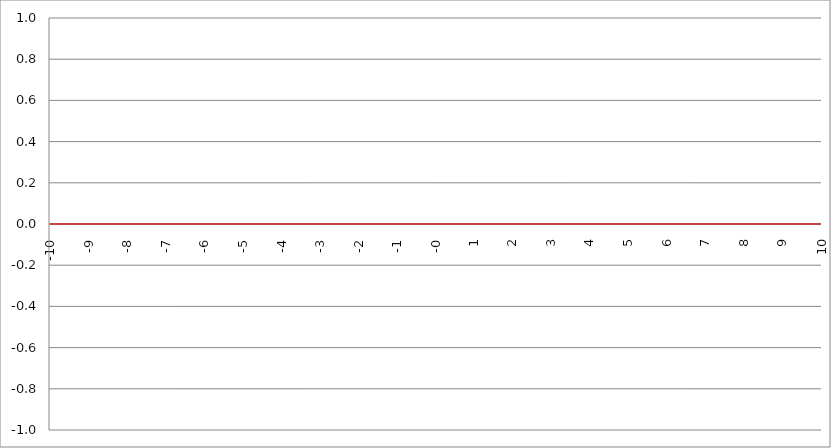
| Category | Series 1 | Series 0 | Series 2 |
|---|---|---|---|
| -10.0 | 0 |  |  |
| -9.99 | 0 |  |  |
| -9.98 | 0 |  |  |
| -9.97 | 0 |  |  |
| -9.96 | 0 |  |  |
| -9.95 | 0 |  |  |
| -9.940000000000001 | 0 |  |  |
| -9.930000000000001 | 0 |  |  |
| -9.920000000000002 | 0 |  |  |
| -9.91 | 0 |  |  |
| -9.900000000000002 | 0 |  |  |
| -9.890000000000002 | 0 |  |  |
| -9.880000000000003 | 0 |  |  |
| -9.870000000000003 | 0 |  |  |
| -9.860000000000001 | 0 |  |  |
| -9.850000000000003 | 0 |  |  |
| -9.840000000000003 | 0 |  |  |
| -9.830000000000004 | 0 |  |  |
| -9.820000000000004 | 0 |  |  |
| -9.810000000000004 | 0 |  |  |
| -9.800000000000004 | 0 |  |  |
| -9.790000000000004 | 0 |  |  |
| -9.780000000000005 | 0 |  |  |
| -9.770000000000005 | 0 |  |  |
| -9.760000000000005 | 0 |  |  |
| -9.750000000000005 | 0 |  |  |
| -9.740000000000006 | 0 |  |  |
| -9.730000000000006 | 0 |  |  |
| -9.720000000000006 | 0 |  |  |
| -9.710000000000006 | 0 |  |  |
| -9.700000000000006 | 0 |  |  |
| -9.690000000000007 | 0 |  |  |
| -9.680000000000007 | 0 |  |  |
| -9.670000000000007 | 0 |  |  |
| -9.660000000000007 | 0 |  |  |
| -9.650000000000007 | 0 |  |  |
| -9.640000000000008 | 0 |  |  |
| -9.630000000000008 | 0 |  |  |
| -9.620000000000008 | 0 |  |  |
| -9.610000000000008 | 0 |  |  |
| -9.600000000000009 | 0 |  |  |
| -9.590000000000009 | 0 |  |  |
| -9.580000000000007 | 0 |  |  |
| -9.57000000000001 | 0 |  |  |
| -9.56000000000001 | 0 |  |  |
| -9.55000000000001 | 0 |  |  |
| -9.54000000000001 | 0 |  |  |
| -9.53000000000001 | 0 |  |  |
| -9.52000000000001 | 0 |  |  |
| -9.51000000000001 | 0 |  |  |
| -9.50000000000001 | 0 |  |  |
| -9.49000000000001 | 0 |  |  |
| -9.48000000000001 | 0 |  |  |
| -9.47000000000001 | 0 |  |  |
| -9.46000000000001 | 0 |  |  |
| -9.45000000000001 | 0 |  |  |
| -9.44000000000001 | 0 |  |  |
| -9.430000000000012 | 0 |  |  |
| -9.420000000000012 | 0 |  |  |
| -9.410000000000013 | 0 |  |  |
| -9.400000000000013 | 0 |  |  |
| -9.390000000000011 | 0 |  |  |
| -9.380000000000013 | 0 |  |  |
| -9.370000000000013 | 0 |  |  |
| -9.360000000000014 | 0 |  |  |
| -9.350000000000014 | 0 |  |  |
| -9.340000000000014 | 0 |  |  |
| -9.330000000000014 | 0 |  |  |
| -9.320000000000014 | 0 |  |  |
| -9.310000000000015 | 0 |  |  |
| -9.300000000000013 | 0 |  |  |
| -9.290000000000015 | 0 |  |  |
| -9.280000000000015 | 0 |  |  |
| -9.270000000000016 | 0 |  |  |
| -9.260000000000016 | 0 |  |  |
| -9.250000000000014 | 0 |  |  |
| -9.240000000000016 | 0 |  |  |
| -9.230000000000016 | 0 |  |  |
| -9.220000000000017 | 0 |  |  |
| -9.210000000000017 | 0 |  |  |
| -9.200000000000017 | 0 |  |  |
| -9.190000000000017 | 0 |  |  |
| -9.180000000000017 | 0 |  |  |
| -9.170000000000018 | 0 |  |  |
| -9.160000000000016 | 0 |  |  |
| -9.150000000000018 | 0 |  |  |
| -9.140000000000018 | 0 |  |  |
| -9.130000000000019 | 0 |  |  |
| -9.120000000000019 | 0 |  |  |
| -9.110000000000017 | 0 |  |  |
| -9.10000000000002 | 0 |  |  |
| -9.09000000000002 | 0 |  |  |
| -9.08000000000002 | 0 |  |  |
| -9.07000000000002 | 0 |  |  |
| -9.06000000000002 | 0 |  |  |
| -9.05000000000002 | 0 |  |  |
| -9.04000000000002 | 0 |  |  |
| -9.03000000000002 | 0 |  |  |
| -9.020000000000021 | 0 |  |  |
| -9.010000000000021 | 0 |  |  |
| -9.000000000000021 | 0 |  |  |
| -8.990000000000022 | 0 |  |  |
| -8.980000000000022 | 0 |  |  |
| -8.97000000000002 | 0 |  |  |
| -8.960000000000022 | 0 |  |  |
| -8.950000000000022 | 0 |  |  |
| -8.940000000000023 | 0 |  |  |
| -8.930000000000023 | 0 |  |  |
| -8.920000000000023 | 0 |  |  |
| -8.910000000000023 | 0 |  |  |
| -8.900000000000023 | 0 |  |  |
| -8.890000000000024 | 0 |  |  |
| -8.880000000000024 | 0 |  |  |
| -8.870000000000024 | 0 |  |  |
| -8.860000000000024 | 0 |  |  |
| -8.850000000000025 | 0 |  |  |
| -8.840000000000025 | 0 |  |  |
| -8.830000000000025 | 0 |  |  |
| -8.820000000000025 | 0 |  |  |
| -8.810000000000025 | 0 |  |  |
| -8.800000000000026 | 0 |  |  |
| -8.790000000000026 | 0 |  |  |
| -8.780000000000026 | 0 |  |  |
| -8.770000000000026 | 0 |  |  |
| -8.760000000000026 | 0 |  |  |
| -8.750000000000027 | 0 |  |  |
| -8.740000000000027 | 0 |  |  |
| -8.730000000000027 | 0 |  |  |
| -8.720000000000027 | 0 |  |  |
| -8.710000000000027 | 0 |  |  |
| -8.700000000000028 | 0 |  |  |
| -8.690000000000028 | 0 |  |  |
| -8.680000000000028 | 0 |  |  |
| -8.670000000000028 | 0 |  |  |
| -8.660000000000029 | 0 |  |  |
| -8.650000000000029 | 0 |  |  |
| -8.640000000000029 | 0 |  |  |
| -8.63000000000003 | 0 |  |  |
| -8.62000000000003 | 0 |  |  |
| -8.61000000000003 | 0 |  |  |
| -8.60000000000003 | 0 |  |  |
| -8.59000000000003 | 0 |  |  |
| -8.58000000000003 | 0 |  |  |
| -8.57000000000003 | 0 |  |  |
| -8.56000000000003 | 0 |  |  |
| -8.55000000000003 | 0 |  |  |
| -8.540000000000031 | 0 |  |  |
| -8.530000000000031 | 0 |  |  |
| -8.520000000000032 | 0 |  |  |
| -8.510000000000032 | 0 |  |  |
| -8.50000000000003 | 0 |  |  |
| -8.490000000000032 | 0 |  |  |
| -8.480000000000032 | 0 |  |  |
| -8.470000000000033 | 0 |  |  |
| -8.460000000000033 | 0 |  |  |
| -8.450000000000033 | 0 |  |  |
| -8.440000000000033 | 0 |  |  |
| -8.430000000000033 | 0 |  |  |
| -8.420000000000034 | 0 |  |  |
| -8.410000000000032 | 0 |  |  |
| -8.400000000000034 | 0 |  |  |
| -8.390000000000034 | 0 |  |  |
| -8.380000000000035 | 0 |  |  |
| -8.370000000000035 | 0 |  |  |
| -8.360000000000033 | 0 |  |  |
| -8.350000000000035 | 0 |  |  |
| -8.340000000000035 | 0 |  |  |
| -8.330000000000036 | 0 |  |  |
| -8.320000000000036 | 0 |  |  |
| -8.310000000000034 | 0 |  |  |
| -8.300000000000036 | 0 |  |  |
| -8.290000000000036 | 0 |  |  |
| -8.280000000000037 | 0 |  |  |
| -8.270000000000037 | 0 |  |  |
| -8.260000000000037 | 0 |  |  |
| -8.250000000000037 | 0 |  |  |
| -8.240000000000038 | 0 |  |  |
| -8.230000000000038 | 0 |  |  |
| -8.220000000000038 | 0 |  |  |
| -8.210000000000038 | 0 |  |  |
| -8.200000000000038 | 0 |  |  |
| -8.190000000000039 | 0 |  |  |
| -8.180000000000039 | 0 |  |  |
| -8.170000000000037 | 0 |  |  |
| -8.16000000000004 | 0 |  |  |
| -8.15000000000004 | 0 |  |  |
| -8.14000000000004 | 0 |  |  |
| -8.13000000000004 | 0 |  |  |
| -8.12000000000004 | 0 |  |  |
| -8.11000000000004 | 0 |  |  |
| -8.10000000000004 | 0 |  |  |
| -8.09000000000004 | 0 |  |  |
| -8.08000000000004 | 0 |  |  |
| -8.07000000000004 | 0 |  |  |
| -8.06000000000004 | 0 |  |  |
| -8.05000000000004 | 0 |  |  |
| -8.040000000000042 | 0 |  |  |
| -8.03000000000004 | 0 |  |  |
| -8.020000000000042 | 0 |  |  |
| -8.010000000000042 | 0 |  |  |
| -8.000000000000043 | 0 |  |  |
| -7.990000000000043 | 0 |  |  |
| -7.980000000000043 | 0 |  |  |
| -7.970000000000043 | 0 |  |  |
| -7.960000000000043 | 0 |  |  |
| -7.950000000000044 | 0 |  |  |
| -7.940000000000044 | 0 |  |  |
| -7.930000000000044 | 0 |  |  |
| -7.920000000000044 | 0 |  |  |
| -7.910000000000044 | 0 |  |  |
| -7.900000000000044 | 0 |  |  |
| -7.890000000000045 | 0 |  |  |
| -7.880000000000045 | 0 |  |  |
| -7.870000000000045 | 0 |  |  |
| -7.860000000000046 | 0 |  |  |
| -7.850000000000046 | 0 |  |  |
| -7.840000000000046 | 0 |  |  |
| -7.830000000000046 | 0 |  |  |
| -7.820000000000046 | 0 |  |  |
| -7.810000000000047 | 0 |  |  |
| -7.800000000000047 | 0 |  |  |
| -7.790000000000047 | 0 |  |  |
| -7.780000000000047 | 0 |  |  |
| -7.770000000000047 | 0 |  |  |
| -7.760000000000048 | 0 |  |  |
| -7.750000000000048 | 0 |  |  |
| -7.740000000000048 | 0 |  |  |
| -7.730000000000048 | 0 |  |  |
| -7.720000000000049 | 0 |  |  |
| -7.710000000000049 | 0 |  |  |
| -7.700000000000049 | 0 |  |  |
| -7.690000000000049 | 0 |  |  |
| -7.680000000000049 | 0 |  |  |
| -7.67000000000005 | 0 |  |  |
| -7.66000000000005 | 0 |  |  |
| -7.65000000000005 | 0 |  |  |
| -7.64000000000005 | 0 |  |  |
| -7.63000000000005 | 0 |  |  |
| -7.620000000000051 | 0 |  |  |
| -7.610000000000051 | 0 |  |  |
| -7.600000000000051 | 0 |  |  |
| -7.590000000000051 | 0 |  |  |
| -7.580000000000052 | 0 |  |  |
| -7.570000000000052 | 0 |  |  |
| -7.560000000000052 | 0 |  |  |
| -7.550000000000052 | 0 |  |  |
| -7.540000000000052 | 0 |  |  |
| -7.530000000000053 | 0 |  |  |
| -7.520000000000053 | 0 |  |  |
| -7.510000000000053 | 0 |  |  |
| -7.500000000000053 | 0 |  |  |
| -7.490000000000053 | 0 |  |  |
| -7.480000000000054 | 0 |  |  |
| -7.470000000000054 | 0 |  |  |
| -7.460000000000054 | 0 |  |  |
| -7.450000000000054 | 0 |  |  |
| -7.440000000000054 | 0 |  |  |
| -7.430000000000054 | 0 |  |  |
| -7.420000000000055 | 0 |  |  |
| -7.410000000000055 | 0 |  |  |
| -7.400000000000055 | 0 |  |  |
| -7.390000000000056 | 0 |  |  |
| -7.380000000000056 | 0 |  |  |
| -7.370000000000056 | 0 |  |  |
| -7.360000000000056 | 0 |  |  |
| -7.350000000000056 | 0 |  |  |
| -7.340000000000057 | 0 |  |  |
| -7.330000000000057 | 0 |  |  |
| -7.320000000000057 | 0 |  |  |
| -7.310000000000057 | 0 |  |  |
| -7.300000000000058 | 0 |  |  |
| -7.290000000000058 | 0 |  |  |
| -7.280000000000058 | 0 |  |  |
| -7.270000000000058 | 0 |  |  |
| -7.260000000000058 | 0 |  |  |
| -7.250000000000059 | 0 |  |  |
| -7.240000000000059 | 0 |  |  |
| -7.23000000000006 | 0 |  |  |
| -7.220000000000059 | 0 |  |  |
| -7.210000000000059 | 0 |  |  |
| -7.20000000000006 | 0 |  |  |
| -7.19000000000006 | 0 |  |  |
| -7.18000000000006 | 0 |  |  |
| -7.17000000000006 | 0 |  |  |
| -7.160000000000061 | 0 |  |  |
| -7.150000000000061 | 0 |  |  |
| -7.140000000000061 | 0 |  |  |
| -7.130000000000061 | 0 |  |  |
| -7.120000000000061 | 0 |  |  |
| -7.110000000000062 | 0 |  |  |
| -7.100000000000062 | 0 |  |  |
| -7.090000000000062 | 0 |  |  |
| -7.080000000000062 | 0 |  |  |
| -7.070000000000062 | 0 |  |  |
| -7.060000000000063 | 0 |  |  |
| -7.050000000000063 | 0 |  |  |
| -7.040000000000063 | 0 |  |  |
| -7.030000000000063 | 0 |  |  |
| -7.020000000000064 | 0 |  |  |
| -7.010000000000064 | 0 |  |  |
| -7.000000000000064 | 0 |  |  |
| -6.990000000000064 | 0 |  |  |
| -6.980000000000064 | 0 |  |  |
| -6.970000000000064 | 0 |  |  |
| -6.960000000000064 | 0 |  |  |
| -6.950000000000064 | 0 |  |  |
| -6.940000000000065 | 0 |  |  |
| -6.930000000000065 | 0 |  |  |
| -6.920000000000065 | 0 |  |  |
| -6.910000000000065 | 0 |  |  |
| -6.900000000000066 | 0 |  |  |
| -6.890000000000066 | 0 |  |  |
| -6.880000000000066 | 0 |  |  |
| -6.870000000000066 | 0 |  |  |
| -6.860000000000067 | 0 |  |  |
| -6.850000000000067 | 0 |  |  |
| -6.840000000000067 | 0 |  |  |
| -6.830000000000067 | 0 |  |  |
| -6.820000000000068 | 0 |  |  |
| -6.810000000000068 | 0 |  |  |
| -6.800000000000068 | 0 |  |  |
| -6.790000000000068 | 0 |  |  |
| -6.780000000000068 | 0 |  |  |
| -6.770000000000068 | 0 |  |  |
| -6.760000000000069 | 0 |  |  |
| -6.75000000000007 | 0 |  |  |
| -6.74000000000007 | 0 |  |  |
| -6.73000000000007 | 0 |  |  |
| -6.72000000000007 | 0 |  |  |
| -6.71000000000007 | 0 |  |  |
| -6.70000000000007 | 0 |  |  |
| -6.69000000000007 | 0 |  |  |
| -6.680000000000071 | 0 |  |  |
| -6.670000000000071 | 0 |  |  |
| -6.660000000000071 | 0 |  |  |
| -6.650000000000071 | 0 |  |  |
| -6.640000000000072 | 0 |  |  |
| -6.630000000000072 | 0 |  |  |
| -6.620000000000072 | 0 |  |  |
| -6.610000000000072 | 0 |  |  |
| -6.600000000000072 | 0 |  |  |
| -6.590000000000073 | 0 |  |  |
| -6.580000000000073 | 0 |  |  |
| -6.570000000000073 | 0 |  |  |
| -6.560000000000073 | 0 |  |  |
| -6.550000000000074 | 0 |  |  |
| -6.540000000000074 | 0 |  |  |
| -6.530000000000074 | 0 |  |  |
| -6.520000000000074 | 0 |  |  |
| -6.510000000000074 | 0 |  |  |
| -6.500000000000074 | 0 |  |  |
| -6.490000000000074 | 0 |  |  |
| -6.480000000000074 | 0 |  |  |
| -6.470000000000075 | 0 |  |  |
| -6.460000000000075 | 0 |  |  |
| -6.450000000000075 | 0 |  |  |
| -6.440000000000075 | 0 |  |  |
| -6.430000000000076 | 0 |  |  |
| -6.420000000000076 | 0 |  |  |
| -6.410000000000076 | 0 |  |  |
| -6.400000000000076 | 0 |  |  |
| -6.390000000000077 | 0 |  |  |
| -6.380000000000077 | 0 |  |  |
| -6.370000000000077 | 0 |  |  |
| -6.360000000000078 | 0 |  |  |
| -6.350000000000078 | 0 |  |  |
| -6.340000000000078 | 0 |  |  |
| -6.330000000000078 | 0 |  |  |
| -6.320000000000078 | 0 |  |  |
| -6.310000000000079 | 0 |  |  |
| -6.300000000000079 | 0 |  |  |
| -6.29000000000008 | 0 |  |  |
| -6.28000000000008 | 0 |  |  |
| -6.27000000000008 | 0 |  |  |
| -6.26000000000008 | 0 |  |  |
| -6.25000000000008 | 0 |  |  |
| -6.24000000000008 | 0 |  |  |
| -6.23000000000008 | 0 |  |  |
| -6.220000000000081 | 0 |  |  |
| -6.210000000000081 | 0 |  |  |
| -6.200000000000081 | 0 |  |  |
| -6.190000000000081 | 0 |  |  |
| -6.180000000000081 | 0 |  |  |
| -6.170000000000082 | 0 |  |  |
| -6.160000000000082 | 0 |  |  |
| -6.150000000000082 | 0 |  |  |
| -6.140000000000082 | 0 |  |  |
| -6.130000000000082 | 0 |  |  |
| -6.120000000000083 | 0 |  |  |
| -6.110000000000083 | 0 |  |  |
| -6.100000000000083 | 0 |  |  |
| -6.090000000000083 | 0 |  |  |
| -6.080000000000084 | 0 |  |  |
| -6.070000000000084 | 0 |  |  |
| -6.060000000000084 | 0 |  |  |
| -6.050000000000084 | 0 |  |  |
| -6.040000000000084 | 0 |  |  |
| -6.030000000000084 | 0 |  |  |
| -6.020000000000085 | 0 |  |  |
| -6.010000000000085 | 0 |  |  |
| -6.000000000000085 | 0 |  |  |
| -5.990000000000085 | 0 |  |  |
| -5.980000000000085 | 0 |  |  |
| -5.970000000000085 | 0 |  |  |
| -5.960000000000086 | 0 |  |  |
| -5.950000000000086 | 0 |  |  |
| -5.940000000000086 | 0 |  |  |
| -5.930000000000086 | 0 |  |  |
| -5.920000000000087 | 0 |  |  |
| -5.910000000000087 | 0 |  |  |
| -5.900000000000087 | 0 |  |  |
| -5.890000000000088 | 0 |  |  |
| -5.880000000000088 | 0 |  |  |
| -5.870000000000088 | 0 |  |  |
| -5.860000000000088 | 0 |  |  |
| -5.850000000000088 | 0 |  |  |
| -5.840000000000089 | 0 |  |  |
| -5.830000000000089 | 0 |  |  |
| -5.820000000000089 | 0 |  |  |
| -5.810000000000089 | 0 |  |  |
| -5.800000000000089 | 0 |  |  |
| -5.79000000000009 | 0 |  |  |
| -5.78000000000009 | 0 |  |  |
| -5.77000000000009 | 0 |  |  |
| -5.76000000000009 | 0 |  |  |
| -5.750000000000091 | 0 |  |  |
| -5.740000000000091 | 0 |  |  |
| -5.730000000000091 | 0 |  |  |
| -5.720000000000091 | 0 |  |  |
| -5.710000000000091 | 0 |  |  |
| -5.700000000000092 | 0 |  |  |
| -5.690000000000092 | 0 |  |  |
| -5.680000000000092 | 0 |  |  |
| -5.670000000000092 | 0 |  |  |
| -5.660000000000092 | 0 |  |  |
| -5.650000000000093 | 0 |  |  |
| -5.640000000000093 | 0 |  |  |
| -5.630000000000093 | 0 |  |  |
| -5.620000000000093 | 0 |  |  |
| -5.610000000000093 | 0 |  |  |
| -5.600000000000094 | 0 |  |  |
| -5.590000000000094 | 0 |  |  |
| -5.580000000000094 | 0 |  |  |
| -5.570000000000094 | 0 |  |  |
| -5.560000000000095 | 0 |  |  |
| -5.550000000000095 | 0 |  |  |
| -5.540000000000095 | 0 |  |  |
| -5.530000000000095 | 0 |  |  |
| -5.520000000000095 | 0 |  |  |
| -5.510000000000096 | 0 |  |  |
| -5.500000000000096 | 0 |  |  |
| -5.490000000000096 | 0 |  |  |
| -5.480000000000096 | 0 |  |  |
| -5.470000000000096 | 0 |  |  |
| -5.460000000000097 | 0 |  |  |
| -5.450000000000097 | 0 |  |  |
| -5.440000000000097 | 0 |  |  |
| -5.430000000000097 | 0 |  |  |
| -5.420000000000098 | 0 |  |  |
| -5.410000000000098 | 0 |  |  |
| -5.400000000000098 | 0 |  |  |
| -5.390000000000098 | 0 |  |  |
| -5.380000000000098 | 0 |  |  |
| -5.370000000000099 | 0 |  |  |
| -5.360000000000099 | 0 |  |  |
| -5.350000000000099 | 0 |  |  |
| -5.340000000000099 | 0 |  |  |
| -5.330000000000099 | 0 |  |  |
| -5.3200000000001 | 0 |  |  |
| -5.3100000000001 | 0 |  |  |
| -5.3000000000001 | 0 |  |  |
| -5.2900000000001 | 0 |  |  |
| -5.2800000000001 | 0 |  |  |
| -5.2700000000001 | 0 |  |  |
| -5.260000000000101 | 0 |  |  |
| -5.250000000000101 | 0 |  |  |
| -5.240000000000101 | 0 |  |  |
| -5.230000000000101 | 0 |  |  |
| -5.220000000000102 | 0 |  |  |
| -5.210000000000102 | 0 |  |  |
| -5.200000000000102 | 0 |  |  |
| -5.190000000000103 | 0 |  |  |
| -5.180000000000103 | 0 |  |  |
| -5.170000000000103 | 0 |  |  |
| -5.160000000000103 | 0 |  |  |
| -5.150000000000103 | 0 |  |  |
| -5.140000000000104 | 0 |  |  |
| -5.130000000000104 | 0 |  |  |
| -5.120000000000104 | 0 |  |  |
| -5.110000000000104 | 0 |  |  |
| -5.100000000000104 | 0 |  |  |
| -5.090000000000104 | 0 |  |  |
| -5.080000000000104 | 0 |  |  |
| -5.070000000000105 | 0 |  |  |
| -5.060000000000105 | 0 |  |  |
| -5.050000000000105 | 0 |  |  |
| -5.040000000000105 | 0 |  |  |
| -5.030000000000105 | 0 |  |  |
| -5.020000000000106 | 0 |  |  |
| -5.010000000000106 | 0 |  |  |
| -5.000000000000106 | 0 |  |  |
| -4.990000000000106 | 0 |  |  |
| -4.980000000000106 | 0 |  |  |
| -4.970000000000107 | 0 |  |  |
| -4.960000000000107 | 0 |  |  |
| -4.950000000000107 | 0 |  |  |
| -4.940000000000107 | 0 |  |  |
| -4.930000000000108 | 0 |  |  |
| -4.920000000000108 | 0 |  |  |
| -4.910000000000108 | 0 |  |  |
| -4.900000000000108 | 0 |  |  |
| -4.890000000000109 | 0 |  |  |
| -4.88000000000011 | 0 |  |  |
| -4.87000000000011 | 0 |  |  |
| -4.86000000000011 | 0 |  |  |
| -4.85000000000011 | 0 |  |  |
| -4.84000000000011 | 0 |  |  |
| -4.83000000000011 | 0 |  |  |
| -4.82000000000011 | 0 |  |  |
| -4.810000000000111 | 0 |  |  |
| -4.800000000000111 | 0 |  |  |
| -4.790000000000111 | 0 |  |  |
| -4.780000000000111 | 0 |  |  |
| -4.770000000000111 | 0 |  |  |
| -4.760000000000112 | 0 |  |  |
| -4.750000000000112 | 0 |  |  |
| -4.740000000000112 | 0 |  |  |
| -4.730000000000112 | 0 |  |  |
| -4.720000000000112 | 0 |  |  |
| -4.710000000000113 | 0 |  |  |
| -4.700000000000113 | 0 |  |  |
| -4.690000000000113 | 0 |  |  |
| -4.680000000000113 | 0 |  |  |
| -4.670000000000114 | 0 |  |  |
| -4.660000000000114 | 0 |  |  |
| -4.650000000000114 | 0 |  |  |
| -4.640000000000114 | 0 |  |  |
| -4.630000000000114 | 0 |  |  |
| -4.620000000000115 | 0 |  |  |
| -4.610000000000115 | 0 |  |  |
| -4.600000000000115 | 0 |  |  |
| -4.590000000000115 | 0 |  |  |
| -4.580000000000115 | 0 |  |  |
| -4.570000000000115 | 0 |  |  |
| -4.560000000000116 | 0 |  |  |
| -4.550000000000116 | 0 |  |  |
| -4.540000000000116 | 0 |  |  |
| -4.530000000000116 | 0 |  |  |
| -4.520000000000117 | 0 |  |  |
| -4.510000000000117 | 0 |  |  |
| -4.500000000000117 | 0 |  |  |
| -4.490000000000117 | 0 |  |  |
| -4.480000000000117 | 0 |  |  |
| -4.470000000000117 | 0 |  |  |
| -4.460000000000118 | 0 |  |  |
| -4.450000000000118 | 0 |  |  |
| -4.440000000000118 | 0 |  |  |
| -4.430000000000118 | 0 |  |  |
| -4.420000000000119 | 0 |  |  |
| -4.41000000000012 | 0 |  |  |
| -4.40000000000012 | 0 |  |  |
| -4.39000000000012 | 0 |  |  |
| -4.38000000000012 | 0 |  |  |
| -4.37000000000012 | 0 |  |  |
| -4.36000000000012 | 0 |  |  |
| -4.35000000000012 | 0 |  |  |
| -4.34000000000012 | 0 |  |  |
| -4.33000000000012 | 0 |  |  |
| -4.320000000000121 | 0 |  |  |
| -4.310000000000121 | 0 |  |  |
| -4.300000000000121 | 0 |  |  |
| -4.290000000000121 | 0 |  |  |
| -4.280000000000121 | 0 |  |  |
| -4.270000000000122 | 0 |  |  |
| -4.260000000000122 | 0 |  |  |
| -4.250000000000122 | 0 |  |  |
| -4.240000000000122 | 0 |  |  |
| -4.230000000000122 | 0 |  |  |
| -4.220000000000123 | 0 |  |  |
| -4.210000000000123 | 0 |  |  |
| -4.200000000000123 | 0 |  |  |
| -4.190000000000124 | 0 |  |  |
| -4.180000000000124 | 0 |  |  |
| -4.170000000000124 | 0 |  |  |
| -4.160000000000124 | 0 |  |  |
| -4.150000000000124 | 0 |  |  |
| -4.140000000000124 | 0 |  |  |
| -4.130000000000125 | 0 |  |  |
| -4.120000000000125 | 0 |  |  |
| -4.110000000000125 | 0 |  |  |
| -4.100000000000125 | 0 |  |  |
| -4.090000000000125 | 0 |  |  |
| -4.080000000000126 | 0 |  |  |
| -4.070000000000126 | 0 |  |  |
| -4.060000000000126 | 0 |  |  |
| -4.050000000000126 | 0 |  |  |
| -4.040000000000127 | 0 |  |  |
| -4.030000000000127 | 0 |  |  |
| -4.020000000000127 | 0 |  |  |
| -4.010000000000127 | 0 |  |  |
| -4.000000000000127 | 0 |  |  |
| -3.990000000000128 | 0 |  |  |
| -3.980000000000128 | 0 |  |  |
| -3.970000000000129 | 0 |  |  |
| -3.960000000000129 | 0 |  |  |
| -3.950000000000129 | 0 |  |  |
| -3.940000000000129 | 0 |  |  |
| -3.930000000000129 | 0 |  |  |
| -3.92000000000013 | 0 |  |  |
| -3.91000000000013 | 0 |  |  |
| -3.90000000000013 | 0 |  |  |
| -3.89000000000013 | 0 |  |  |
| -3.88000000000013 | 0 |  |  |
| -3.870000000000131 | 0 |  |  |
| -3.860000000000131 | 0 |  |  |
| -3.850000000000131 | 0 |  |  |
| -3.840000000000131 | 0 |  |  |
| -3.830000000000131 | 0 |  |  |
| -3.820000000000132 | 0 |  |  |
| -3.810000000000132 | 0 |  |  |
| -3.800000000000132 | 0 |  |  |
| -3.790000000000132 | 0 |  |  |
| -3.780000000000132 | 0 |  |  |
| -3.770000000000133 | 0 |  |  |
| -3.760000000000133 | 0 |  |  |
| -3.750000000000133 | 0 |  |  |
| -3.740000000000133 | 0 |  |  |
| -3.730000000000134 | 0 |  |  |
| -3.720000000000134 | 0 |  |  |
| -3.710000000000134 | 0 |  |  |
| -3.700000000000134 | 0 |  |  |
| -3.690000000000134 | 0 |  |  |
| -3.680000000000135 | 0 |  |  |
| -3.670000000000135 | 0 |  |  |
| -3.660000000000135 | 0 |  |  |
| -3.650000000000135 | 0 |  |  |
| -3.640000000000135 | 0 |  |  |
| -3.630000000000136 | 0 |  |  |
| -3.620000000000136 | 0 |  |  |
| -3.610000000000136 | 0 |  |  |
| -3.600000000000136 | 0 |  |  |
| -3.590000000000137 | 0 |  |  |
| -3.580000000000137 | 0 |  |  |
| -3.570000000000137 | 0 |  |  |
| -3.560000000000137 | 0 |  |  |
| -3.550000000000137 | 0 |  |  |
| -3.540000000000138 | 0 |  |  |
| -3.530000000000138 | 0 |  |  |
| -3.520000000000138 | 0 |  |  |
| -3.510000000000138 | 0 |  |  |
| -3.500000000000139 | 0 |  |  |
| -3.490000000000139 | 0 |  |  |
| -3.480000000000139 | 0 |  |  |
| -3.470000000000139 | 0 |  |  |
| -3.460000000000139 | 0 |  |  |
| -3.45000000000014 | 0 |  |  |
| -3.44000000000014 | 0 |  |  |
| -3.43000000000014 | 0 |  |  |
| -3.42000000000014 | 0 |  |  |
| -3.41000000000014 | 0 |  |  |
| -3.400000000000141 | 0 |  |  |
| -3.390000000000141 | 0 |  |  |
| -3.380000000000141 | 0 |  |  |
| -3.370000000000141 | 0 |  |  |
| -3.360000000000141 | 0 |  |  |
| -3.350000000000142 | 0 |  |  |
| -3.340000000000142 | 0 |  |  |
| -3.330000000000142 | 0 |  |  |
| -3.320000000000142 | 0 |  |  |
| -3.310000000000143 | 0 |  |  |
| -3.300000000000143 | 0 |  |  |
| -3.290000000000143 | 0 |  |  |
| -3.280000000000143 | 0 |  |  |
| -3.270000000000143 | 0 |  |  |
| -3.260000000000144 | 0 |  |  |
| -3.250000000000144 | 0 |  |  |
| -3.240000000000144 | 0 |  |  |
| -3.230000000000144 | 0 |  |  |
| -3.220000000000145 | 0 |  |  |
| -3.210000000000145 | 0 |  |  |
| -3.200000000000145 | 0 |  |  |
| -3.190000000000145 | 0 |  |  |
| -3.180000000000145 | 0 |  |  |
| -3.170000000000146 | 0 |  |  |
| -3.160000000000146 | 0 |  |  |
| -3.150000000000146 | 0 |  |  |
| -3.140000000000146 | 0 |  |  |
| -3.130000000000146 | 0 |  |  |
| -3.120000000000147 | 0 |  |  |
| -3.110000000000147 | 0 |  |  |
| -3.100000000000147 | 0 |  |  |
| -3.090000000000147 | 0 |  |  |
| -3.080000000000147 | 0 |  |  |
| -3.070000000000148 | 0 |  |  |
| -3.060000000000148 | 0 |  |  |
| -3.050000000000148 | 0 |  |  |
| -3.040000000000148 | 0 |  |  |
| -3.030000000000149 | 0 |  |  |
| -3.020000000000149 | 0 |  |  |
| -3.010000000000149 | 0 |  |  |
| -3.000000000000149 | 0 |  |  |
| -2.990000000000149 | 0 |  |  |
| -2.98000000000015 | 0 |  |  |
| -2.97000000000015 | 0 |  |  |
| -2.96000000000015 | 0 |  |  |
| -2.95000000000015 | 0 |  |  |
| -2.94000000000015 | 0 |  |  |
| -2.930000000000151 | 0 |  |  |
| -2.920000000000151 | 0 |  |  |
| -2.910000000000151 | 0 |  |  |
| -2.900000000000151 | 0 |  |  |
| -2.890000000000151 | 0 |  |  |
| -2.880000000000152 | 0 |  |  |
| -2.870000000000152 | 0 |  |  |
| -2.860000000000152 | 0 |  |  |
| -2.850000000000152 | 0 |  |  |
| -2.840000000000153 | 0 |  |  |
| -2.830000000000153 | 0 |  |  |
| -2.820000000000153 | 0 |  |  |
| -2.810000000000153 | 0 |  |  |
| -2.800000000000153 | 0 |  |  |
| -2.790000000000154 | 0 |  |  |
| -2.780000000000154 | 0 |  |  |
| -2.770000000000154 | 0 |  |  |
| -2.760000000000154 | 0 |  |  |
| -2.750000000000154 | 0 |  |  |
| -2.740000000000155 | 0 |  |  |
| -2.730000000000155 | 0 |  |  |
| -2.720000000000155 | 0 |  |  |
| -2.710000000000155 | 0 |  |  |
| -2.700000000000156 | 0 |  |  |
| -2.690000000000156 | 0 |  |  |
| -2.680000000000156 | 0 |  |  |
| -2.670000000000156 | 0 |  |  |
| -2.660000000000156 | 0 |  |  |
| -2.650000000000157 | 0 |  |  |
| -2.640000000000157 | 0 |  |  |
| -2.630000000000157 | 0 |  |  |
| -2.620000000000157 | 0 |  |  |
| -2.610000000000157 | 0 |  |  |
| -2.600000000000158 | 0 |  |  |
| -2.590000000000158 | 0 |  |  |
| -2.580000000000158 | 0 |  |  |
| -2.570000000000158 | 0 |  |  |
| -2.560000000000159 | 0 |  |  |
| -2.550000000000159 | 0 |  |  |
| -2.54000000000016 | 0 |  |  |
| -2.530000000000159 | 0 |  |  |
| -2.520000000000159 | 0 |  |  |
| -2.51000000000016 | 0 |  |  |
| -2.50000000000016 | 0 |  |  |
| -2.49000000000016 | 0 |  |  |
| -2.48000000000016 | 0 |  |  |
| -2.47000000000016 | 0 |  |  |
| -2.460000000000161 | 0 |  |  |
| -2.450000000000161 | 0 |  |  |
| -2.440000000000161 | 0 |  |  |
| -2.430000000000161 | 0 |  |  |
| -2.420000000000162 | 0 |  |  |
| -2.410000000000162 | 0 |  |  |
| -2.400000000000162 | 0 |  |  |
| -2.390000000000162 | 0 |  |  |
| -2.380000000000162 | 0 |  |  |
| -2.370000000000163 | 0 |  |  |
| -2.360000000000163 | 0 |  |  |
| -2.350000000000163 | 0 |  |  |
| -2.340000000000163 | 0 |  |  |
| -2.330000000000163 | 0 |  |  |
| -2.320000000000164 | 0 |  |  |
| -2.310000000000164 | 0 |  |  |
| -2.300000000000164 | 0 |  |  |
| -2.290000000000164 | 0 |  |  |
| -2.280000000000165 | 0 |  |  |
| -2.270000000000165 | 0 |  |  |
| -2.260000000000165 | 0 |  |  |
| -2.250000000000165 | 0 |  |  |
| -2.240000000000165 | 0 |  |  |
| -2.230000000000166 | 0 |  |  |
| -2.220000000000166 | 0 |  |  |
| -2.210000000000166 | 0 |  |  |
| -2.200000000000166 | 0 |  |  |
| -2.190000000000166 | 0 |  |  |
| -2.180000000000167 | 0 |  |  |
| -2.170000000000167 | 0 |  |  |
| -2.160000000000167 | 0 |  |  |
| -2.150000000000167 | 0 |  |  |
| -2.140000000000168 | 0 |  |  |
| -2.130000000000168 | 0 |  |  |
| -2.120000000000168 | 0 |  |  |
| -2.110000000000168 | 0 |  |  |
| -2.100000000000168 | 0 |  |  |
| -2.090000000000169 | 0 |  |  |
| -2.080000000000169 | 0 |  |  |
| -2.070000000000169 | 0 |  |  |
| -2.060000000000169 | 0 |  |  |
| -2.050000000000169 | 0 |  |  |
| -2.04000000000017 | 0 |  |  |
| -2.03000000000017 | 0 |  |  |
| -2.02000000000017 | 0 |  |  |
| -2.01000000000017 | 0 |  |  |
| -2.000000000000171 | 0 |  |  |
| -1.99000000000017 | 0 |  |  |
| -1.98000000000017 | 0 |  |  |
| -1.97000000000017 | 0 |  |  |
| -1.96000000000017 | 0 |  |  |
| -1.95000000000017 | 0 |  |  |
| -1.94000000000017 | 0 |  |  |
| -1.93000000000017 | 0 |  |  |
| -1.92000000000017 | 0 |  |  |
| -1.91000000000017 | 0 |  |  |
| -1.90000000000017 | 0 |  |  |
| -1.89000000000017 | 0 |  |  |
| -1.88000000000017 | 0 |  |  |
| -1.87000000000017 | 0 |  |  |
| -1.86000000000017 | 0 |  |  |
| -1.85000000000017 | 0 |  |  |
| -1.84000000000017 | 0 |  |  |
| -1.83000000000017 | 0 |  |  |
| -1.82000000000017 | 0 |  |  |
| -1.81000000000017 | 0 |  |  |
| -1.80000000000017 | 0 |  |  |
| -1.79000000000017 | 0 |  |  |
| -1.78000000000017 | 0 |  |  |
| -1.77000000000017 | 0 |  |  |
| -1.76000000000017 | 0 |  |  |
| -1.75000000000017 | 0 |  |  |
| -1.74000000000017 | 0 |  |  |
| -1.73000000000017 | 0 |  |  |
| -1.72000000000017 | 0 |  |  |
| -1.71000000000017 | 0 |  |  |
| -1.70000000000017 | 0 |  |  |
| -1.69000000000017 | 0 |  |  |
| -1.68000000000017 | 0 |  |  |
| -1.67000000000017 | 0 |  |  |
| -1.66000000000017 | 0 |  |  |
| -1.65000000000017 | 0 |  |  |
| -1.64000000000017 | 0 |  |  |
| -1.63000000000017 | 0 |  |  |
| -1.62000000000017 | 0 |  |  |
| -1.61000000000017 | 0 |  |  |
| -1.60000000000017 | 0 |  |  |
| -1.59000000000017 | 0 |  |  |
| -1.58000000000017 | 0 |  |  |
| -1.57000000000017 | 0 |  |  |
| -1.56000000000017 | 0 |  |  |
| -1.55000000000017 | 0 |  |  |
| -1.54000000000017 | 0 |  |  |
| -1.53000000000017 | 0 |  |  |
| -1.52000000000017 | 0 |  |  |
| -1.51000000000017 | 0 |  |  |
| -1.50000000000017 | 0 |  |  |
| -1.49000000000017 | 0 |  |  |
| -1.48000000000017 | 0 |  |  |
| -1.47000000000017 | 0 |  |  |
| -1.46000000000017 | 0 |  |  |
| -1.45000000000017 | 0 |  |  |
| -1.44000000000017 | 0 |  |  |
| -1.43000000000017 | 0 |  |  |
| -1.42000000000017 | 0 |  |  |
| -1.41000000000017 | 0 |  |  |
| -1.40000000000017 | 0 |  |  |
| -1.39000000000017 | 0 |  |  |
| -1.38000000000017 | 0 |  |  |
| -1.37000000000017 | 0 |  |  |
| -1.36000000000017 | 0 |  |  |
| -1.35000000000017 | 0 |  |  |
| -1.34000000000017 | 0 |  |  |
| -1.33000000000017 | 0 |  |  |
| -1.32000000000017 | 0 |  |  |
| -1.31000000000017 | 0 |  |  |
| -1.30000000000017 | 0 |  |  |
| -1.29000000000017 | 0 |  |  |
| -1.28000000000017 | 0 |  |  |
| -1.27000000000017 | 0 |  |  |
| -1.26000000000017 | 0 |  |  |
| -1.25000000000017 | 0 |  |  |
| -1.24000000000017 | 0 |  |  |
| -1.23000000000017 | 0 |  |  |
| -1.22000000000017 | 0 |  |  |
| -1.21000000000017 | 0 |  |  |
| -1.20000000000017 | 0 |  |  |
| -1.19000000000017 | 0 |  |  |
| -1.18000000000017 | 0 |  |  |
| -1.17000000000017 | 0 |  |  |
| -1.16000000000017 | 0 |  |  |
| -1.15000000000017 | 0 |  |  |
| -1.14000000000017 | 0 |  |  |
| -1.13000000000017 | 0 |  |  |
| -1.12000000000017 | 0 |  |  |
| -1.11000000000017 | 0 |  |  |
| -1.10000000000017 | 0 |  |  |
| -1.09000000000017 | 0 |  |  |
| -1.08000000000017 | 0 |  |  |
| -1.07000000000017 | 0 |  |  |
| -1.06000000000017 | 0 |  |  |
| -1.05000000000017 | 0 |  |  |
| -1.04000000000017 | 0 |  |  |
| -1.03000000000017 | 0 |  |  |
| -1.02000000000017 | 0 |  |  |
| -1.01000000000017 | 0 |  |  |
| -1.00000000000017 | 0 |  |  |
| -0.99000000000017 | 0 |  |  |
| -0.98000000000017 | 0 |  |  |
| -0.97000000000017 | 0 |  |  |
| -0.96000000000017 | 0 |  |  |
| -0.95000000000017 | 0 |  |  |
| -0.94000000000017 | 0 |  |  |
| -0.93000000000017 | 0 |  |  |
| -0.92000000000017 | 0 |  |  |
| -0.91000000000017 | 0 |  |  |
| -0.90000000000017 | 0 |  |  |
| -0.890000000000169 | 0 |  |  |
| -0.880000000000169 | 0 |  |  |
| -0.870000000000169 | 0 |  |  |
| -0.860000000000169 | 0 |  |  |
| -0.850000000000169 | 0 |  |  |
| -0.840000000000169 | 0 |  |  |
| -0.830000000000169 | 0 |  |  |
| -0.820000000000169 | 0 |  |  |
| -0.810000000000169 | 0 |  |  |
| -0.800000000000169 | 0 |  |  |
| -0.790000000000169 | 0 |  |  |
| -0.780000000000169 | 0 |  |  |
| -0.770000000000169 | 0 |  |  |
| -0.760000000000169 | 0 |  |  |
| -0.750000000000169 | 0 |  |  |
| -0.740000000000169 | 0 |  |  |
| -0.730000000000169 | 0 |  |  |
| -0.720000000000169 | 0 |  |  |
| -0.710000000000169 | 0 |  |  |
| -0.700000000000169 | 0 |  |  |
| -0.690000000000169 | 0 |  |  |
| -0.680000000000169 | 0 |  |  |
| -0.670000000000169 | 0 |  |  |
| -0.660000000000169 | 0 |  |  |
| -0.650000000000169 | 0 |  |  |
| -0.640000000000169 | 0 |  |  |
| -0.630000000000169 | 0 |  |  |
| -0.620000000000169 | 0 |  |  |
| -0.610000000000169 | 0 |  |  |
| -0.600000000000169 | 0 |  |  |
| -0.590000000000169 | 0 |  |  |
| -0.580000000000169 | 0 |  |  |
| -0.570000000000169 | 0 |  |  |
| -0.560000000000169 | 0 |  |  |
| -0.550000000000169 | 0 |  |  |
| -0.540000000000169 | 0 |  |  |
| -0.530000000000169 | 0 |  |  |
| -0.520000000000169 | 0 |  |  |
| -0.510000000000169 | 0 |  |  |
| -0.500000000000169 | 0 |  |  |
| -0.490000000000169 | 0 |  |  |
| -0.480000000000169 | 0 |  |  |
| -0.470000000000169 | 0 |  |  |
| -0.460000000000169 | 0 |  |  |
| -0.450000000000169 | 0 |  |  |
| -0.440000000000169 | 0 |  |  |
| -0.430000000000169 | 0 |  |  |
| -0.420000000000169 | 0 |  |  |
| -0.410000000000169 | 0 |  |  |
| -0.400000000000169 | 0 |  |  |
| -0.390000000000169 | 0 |  |  |
| -0.380000000000169 | 0 |  |  |
| -0.370000000000169 | 0 |  |  |
| -0.360000000000169 | 0 |  |  |
| -0.350000000000169 | 0 |  |  |
| -0.340000000000169 | 0 |  |  |
| -0.330000000000169 | 0 |  |  |
| -0.320000000000169 | 0 |  |  |
| -0.310000000000169 | 0 |  |  |
| -0.300000000000169 | 0 |  |  |
| -0.290000000000169 | 0 |  |  |
| -0.280000000000169 | 0 |  |  |
| -0.270000000000169 | 0 |  |  |
| -0.260000000000169 | 0 |  |  |
| -0.250000000000169 | 0 |  |  |
| -0.240000000000169 | 0 |  |  |
| -0.230000000000169 | 0 |  |  |
| -0.220000000000169 | 0 |  |  |
| -0.210000000000169 | 0 |  |  |
| -0.200000000000169 | 0 |  |  |
| -0.190000000000169 | 0 |  |  |
| -0.180000000000169 | 0 |  |  |
| -0.170000000000169 | 0 |  |  |
| -0.160000000000169 | 0 |  |  |
| -0.150000000000169 | 0 |  |  |
| -0.140000000000169 | 0 |  |  |
| -0.130000000000169 | 0 |  |  |
| -0.120000000000169 | 0 |  |  |
| -0.110000000000169 | 0 |  |  |
| -0.100000000000169 | 0 |  |  |
| -0.0900000000001689 | 0 |  |  |
| -0.0800000000001689 | 0 |  |  |
| -0.0700000000001689 | 0 |  |  |
| -0.0600000000001689 | 0 |  |  |
| -0.0500000000001689 | 0 |  |  |
| -0.0400000000001689 | 0 |  |  |
| -0.0300000000001689 | 0 |  |  |
| -0.0200000000001689 | 0 |  |  |
| -0.0100000000001689 | 0 |  |  |
| -1.6888920817415e-13 | 0 |  |  |
| 0.00999999999983111 | 0 |  |  |
| 0.0199999999998311 | 0 |  |  |
| 0.0299999999998311 | 0 |  |  |
| 0.0399999999998311 | 0 |  |  |
| 0.0499999999998311 | 0 |  |  |
| 0.0599999999998311 | 0 |  |  |
| 0.0699999999998311 | 0 |  |  |
| 0.0799999999998311 | 0 |  |  |
| 0.0899999999998311 | 0 |  |  |
| 0.0999999999998311 | 0 |  |  |
| 0.109999999999831 | 0 |  |  |
| 0.119999999999831 | 0 |  |  |
| 0.129999999999831 | 0 |  |  |
| 0.139999999999831 | 0 |  |  |
| 0.149999999999831 | 0 |  |  |
| 0.159999999999831 | 0 |  |  |
| 0.169999999999831 | 0 |  |  |
| 0.179999999999831 | 0 |  |  |
| 0.189999999999831 | 0 |  |  |
| 0.199999999999831 | 0 |  |  |
| 0.209999999999831 | 0 |  |  |
| 0.219999999999831 | 0 |  |  |
| 0.229999999999831 | 0 |  |  |
| 0.239999999999831 | 0 |  |  |
| 0.249999999999831 | 0 |  |  |
| 0.259999999999831 | 0 |  |  |
| 0.269999999999831 | 0 |  |  |
| 0.279999999999831 | 0 |  |  |
| 0.289999999999831 | 0 |  |  |
| 0.299999999999831 | 0 |  |  |
| 0.309999999999831 | 0 |  |  |
| 0.319999999999831 | 0 |  |  |
| 0.329999999999831 | 0 |  |  |
| 0.339999999999831 | 0 |  |  |
| 0.349999999999831 | 0 |  |  |
| 0.359999999999831 | 0 |  |  |
| 0.369999999999831 | 0 |  |  |
| 0.379999999999831 | 0 |  |  |
| 0.389999999999831 | 0 |  |  |
| 0.399999999999831 | 0 |  |  |
| 0.409999999999831 | 0 |  |  |
| 0.419999999999831 | 0 |  |  |
| 0.429999999999831 | 0 |  |  |
| 0.439999999999831 | 0 |  |  |
| 0.449999999999831 | 0 |  |  |
| 0.459999999999831 | 0 |  |  |
| 0.469999999999831 | 0 |  |  |
| 0.479999999999831 | 0 |  |  |
| 0.489999999999831 | 0 |  |  |
| 0.499999999999831 | 0 |  |  |
| 0.509999999999831 | 0 |  |  |
| 0.519999999999831 | 0 |  |  |
| 0.529999999999831 | 0 |  |  |
| 0.539999999999831 | 0 |  |  |
| 0.549999999999831 | 0 |  |  |
| 0.559999999999831 | 0 |  |  |
| 0.569999999999831 | 0 |  |  |
| 0.579999999999831 | 0 |  |  |
| 0.589999999999831 | 0 |  |  |
| 0.599999999999831 | 0 |  |  |
| 0.609999999999831 | 0 |  |  |
| 0.619999999999831 | 0 |  |  |
| 0.629999999999831 | 0 |  |  |
| 0.639999999999831 | 0 |  |  |
| 0.649999999999831 | 0 |  |  |
| 0.659999999999831 | 0 |  |  |
| 0.669999999999831 | 0 |  |  |
| 0.679999999999831 | 0 |  |  |
| 0.689999999999831 | 0 |  |  |
| 0.699999999999831 | 0 |  |  |
| 0.709999999999831 | 0 |  |  |
| 0.719999999999831 | 0 |  |  |
| 0.729999999999831 | 0 |  |  |
| 0.739999999999831 | 0 |  |  |
| 0.749999999999832 | 0 |  |  |
| 0.759999999999832 | 0 |  |  |
| 0.769999999999832 | 0 |  |  |
| 0.779999999999832 | 0 |  |  |
| 0.789999999999832 | 0 |  |  |
| 0.799999999999832 | 0 |  |  |
| 0.809999999999832 | 0 |  |  |
| 0.819999999999832 | 0 |  |  |
| 0.829999999999832 | 0 |  |  |
| 0.839999999999832 | 0 |  |  |
| 0.849999999999832 | 0 |  |  |
| 0.859999999999832 | 0 |  |  |
| 0.869999999999832 | 0 |  |  |
| 0.879999999999832 | 0 |  |  |
| 0.889999999999832 | 0 |  |  |
| 0.899999999999832 | 0 |  |  |
| 0.909999999999832 | 0 |  |  |
| 0.919999999999832 | 0 |  |  |
| 0.929999999999832 | 0 |  |  |
| 0.939999999999832 | 0 |  |  |
| 0.949999999999832 | 0 |  |  |
| 0.959999999999832 | 0 |  |  |
| 0.969999999999832 | 0 |  |  |
| 0.979999999999832 | 0 |  |  |
| 0.989999999999832 | 0 |  |  |
| 0.999999999999832 | 0 |  |  |
| 1.009999999999832 | 0 |  |  |
| 1.019999999999832 | 0 |  |  |
| 1.029999999999832 | 0 |  |  |
| 1.039999999999832 | 0 |  |  |
| 1.049999999999832 | 0 |  |  |
| 1.059999999999832 | 0 |  |  |
| 1.069999999999832 | 0 |  |  |
| 1.079999999999832 | 0 |  |  |
| 1.089999999999832 | 0 |  |  |
| 1.099999999999832 | 0 |  |  |
| 1.109999999999832 | 0 |  |  |
| 1.119999999999832 | 0 |  |  |
| 1.129999999999832 | 0 |  |  |
| 1.139999999999832 | 0 |  |  |
| 1.149999999999832 | 0 |  |  |
| 1.159999999999832 | 0 |  |  |
| 1.169999999999832 | 0 |  |  |
| 1.179999999999832 | 0 |  |  |
| 1.189999999999832 | 0 |  |  |
| 1.199999999999832 | 0 |  |  |
| 1.209999999999832 | 0 |  |  |
| 1.219999999999832 | 0 |  |  |
| 1.229999999999832 | 0 |  |  |
| 1.239999999999832 | 0 |  |  |
| 1.249999999999832 | 0 |  |  |
| 1.259999999999832 | 0 |  |  |
| 1.269999999999832 | 0 |  |  |
| 1.279999999999832 | 0 |  |  |
| 1.289999999999832 | 0 |  |  |
| 1.299999999999832 | 0 |  |  |
| 1.309999999999832 | 0 |  |  |
| 1.319999999999832 | 0 |  |  |
| 1.329999999999832 | 0 |  |  |
| 1.339999999999832 | 0 |  |  |
| 1.349999999999832 | 0 |  |  |
| 1.359999999999832 | 0 |  |  |
| 1.369999999999832 | 0 |  |  |
| 1.379999999999832 | 0 |  |  |
| 1.389999999999832 | 0 |  |  |
| 1.399999999999832 | 0 |  |  |
| 1.409999999999832 | 0 |  |  |
| 1.419999999999832 | 0 |  |  |
| 1.429999999999832 | 0 |  |  |
| 1.439999999999832 | 0 |  |  |
| 1.449999999999832 | 0 |  |  |
| 1.459999999999832 | 0 |  |  |
| 1.469999999999832 | 0 |  |  |
| 1.479999999999832 | 0 |  |  |
| 1.489999999999832 | 0 |  |  |
| 1.499999999999832 | 0 |  |  |
| 1.509999999999832 | 0 |  |  |
| 1.519999999999832 | 0 |  |  |
| 1.529999999999832 | 0 |  |  |
| 1.539999999999832 | 0 |  |  |
| 1.549999999999832 | 0 |  |  |
| 1.559999999999832 | 0 |  |  |
| 1.569999999999832 | 0 |  |  |
| 1.579999999999832 | 0 |  |  |
| 1.589999999999832 | 0 |  |  |
| 1.599999999999832 | 0 |  |  |
| 1.609999999999832 | 0 |  |  |
| 1.619999999999832 | 0 |  |  |
| 1.629999999999832 | 0 |  |  |
| 1.639999999999832 | 0 |  |  |
| 1.649999999999832 | 0 |  |  |
| 1.659999999999832 | 0 |  |  |
| 1.669999999999832 | 0 |  |  |
| 1.679999999999832 | 0 |  |  |
| 1.689999999999832 | 0 |  |  |
| 1.699999999999832 | 0 |  |  |
| 1.709999999999832 | 0 |  |  |
| 1.719999999999832 | 0 |  |  |
| 1.729999999999832 | 0 |  |  |
| 1.739999999999832 | 0 |  |  |
| 1.749999999999832 | 0 |  |  |
| 1.759999999999832 | 0 |  |  |
| 1.769999999999832 | 0 |  |  |
| 1.779999999999832 | 0 |  |  |
| 1.789999999999832 | 0 |  |  |
| 1.799999999999832 | 0 |  |  |
| 1.809999999999832 | 0 |  |  |
| 1.819999999999832 | 0 |  |  |
| 1.829999999999832 | 0 |  |  |
| 1.839999999999832 | 0 |  |  |
| 1.849999999999832 | 0 |  |  |
| 1.859999999999832 | 0 |  |  |
| 1.869999999999832 | 0 |  |  |
| 1.879999999999832 | 0 |  |  |
| 1.889999999999832 | 0 |  |  |
| 1.899999999999832 | 0 |  |  |
| 1.909999999999832 | 0 |  |  |
| 1.919999999999832 | 0 |  |  |
| 1.929999999999832 | 0 |  |  |
| 1.939999999999832 | 0 |  |  |
| 1.949999999999833 | 0 |  |  |
| 1.959999999999833 | 0 |  |  |
| 1.969999999999833 | 0 |  |  |
| 1.979999999999833 | 0 |  |  |
| 1.989999999999833 | 0 |  |  |
| 1.999999999999833 | 0 |  |  |
| 2.009999999999832 | 0 |  |  |
| 2.019999999999832 | 0 |  |  |
| 2.029999999999832 | 0 |  |  |
| 2.039999999999832 | 0 |  |  |
| 2.049999999999832 | 0 |  |  |
| 2.059999999999831 | 0 |  |  |
| 2.069999999999831 | 0 |  |  |
| 2.079999999999831 | 0 |  |  |
| 2.089999999999831 | 0 |  |  |
| 2.09999999999983 | 0 |  |  |
| 2.10999999999983 | 0 |  |  |
| 2.11999999999983 | 0 |  |  |
| 2.12999999999983 | 0 |  |  |
| 2.13999999999983 | 0 |  |  |
| 2.149999999999829 | 0 |  |  |
| 2.159999999999829 | 0 |  |  |
| 2.169999999999829 | 0 |  |  |
| 2.179999999999829 | 0 |  |  |
| 2.189999999999829 | 0 |  |  |
| 2.199999999999828 | 0 |  |  |
| 2.209999999999828 | 0 |  |  |
| 2.219999999999828 | 0 |  |  |
| 2.229999999999828 | 0 |  |  |
| 2.239999999999827 | 0 |  |  |
| 2.249999999999827 | 0 |  |  |
| 2.259999999999827 | 0 |  |  |
| 2.269999999999827 | 0 |  |  |
| 2.279999999999827 | 0 |  |  |
| 2.289999999999826 | 0 |  |  |
| 2.299999999999826 | 0 |  |  |
| 2.309999999999826 | 0 |  |  |
| 2.319999999999826 | 0 |  |  |
| 2.329999999999825 | 0 |  |  |
| 2.339999999999825 | 0 |  |  |
| 2.349999999999825 | 0 |  |  |
| 2.359999999999825 | 0 |  |  |
| 2.369999999999825 | 0 |  |  |
| 2.379999999999824 | 0 |  |  |
| 2.389999999999824 | 0 |  |  |
| 2.399999999999824 | 0 |  |  |
| 2.409999999999824 | 0 |  |  |
| 2.419999999999824 | 0 |  |  |
| 2.429999999999823 | 0 |  |  |
| 2.439999999999823 | 0 |  |  |
| 2.449999999999823 | 0 |  |  |
| 2.459999999999823 | 0 |  |  |
| 2.469999999999823 | 0 |  |  |
| 2.479999999999822 | 0 |  |  |
| 2.489999999999822 | 0 |  |  |
| 2.499999999999822 | 0 |  |  |
| 2.509999999999822 | 0 |  |  |
| 2.519999999999821 | 0 |  |  |
| 2.529999999999821 | 0 |  |  |
| 2.539999999999821 | 0 |  |  |
| 2.549999999999821 | 0 |  |  |
| 2.559999999999821 | 0 |  |  |
| 2.56999999999982 | 0 |  |  |
| 2.57999999999982 | 0 |  |  |
| 2.58999999999982 | 0 |  |  |
| 2.59999999999982 | 0 |  |  |
| 2.609999999999819 | 0 |  |  |
| 2.619999999999819 | 0 |  |  |
| 2.629999999999819 | 0 |  |  |
| 2.639999999999819 | 0 |  |  |
| 2.649999999999819 | 0 |  |  |
| 2.659999999999818 | 0 |  |  |
| 2.669999999999818 | 0 |  |  |
| 2.679999999999818 | 0 |  |  |
| 2.689999999999818 | 0 |  |  |
| 2.699999999999818 | 0 |  |  |
| 2.709999999999817 | 0 |  |  |
| 2.719999999999817 | 0 |  |  |
| 2.729999999999817 | 0 |  |  |
| 2.739999999999817 | 0 |  |  |
| 2.749999999999817 | 0 |  |  |
| 2.759999999999816 | 0 |  |  |
| 2.769999999999816 | 0 |  |  |
| 2.779999999999816 | 0 |  |  |
| 2.789999999999816 | 0 |  |  |
| 2.799999999999815 | 0 |  |  |
| 2.809999999999815 | 0 |  |  |
| 2.819999999999815 | 0 |  |  |
| 2.829999999999815 | 0 |  |  |
| 2.839999999999815 | 0 |  |  |
| 2.849999999999814 | 0 |  |  |
| 2.859999999999814 | 0 |  |  |
| 2.869999999999814 | 0 |  |  |
| 2.879999999999814 | 0 |  |  |
| 2.889999999999814 | 0 |  |  |
| 2.899999999999813 | 0 |  |  |
| 2.909999999999813 | 0 |  |  |
| 2.919999999999813 | 0 |  |  |
| 2.929999999999813 | 0 |  |  |
| 2.939999999999813 | 0 |  |  |
| 2.949999999999812 | 0 |  |  |
| 2.959999999999812 | 0 |  |  |
| 2.969999999999812 | 0 |  |  |
| 2.979999999999812 | 0 |  |  |
| 2.989999999999811 | 0 |  |  |
| 2.999999999999811 | 0 |  |  |
| 3.009999999999811 | 0 |  |  |
| 3.019999999999811 | 0 |  |  |
| 3.029999999999811 | 0 |  |  |
| 3.03999999999981 | 0 |  |  |
| 3.04999999999981 | 0 |  |  |
| 3.05999999999981 | 0 |  |  |
| 3.06999999999981 | 0 |  |  |
| 3.07999999999981 | 0 |  |  |
| 3.089999999999809 | 0 |  |  |
| 3.099999999999809 | 0 |  |  |
| 3.109999999999809 | 0 |  |  |
| 3.119999999999809 | 0 |  |  |
| 3.129999999999808 | 0 |  |  |
| 3.139999999999808 | 0 |  |  |
| 3.149999999999808 | 0 |  |  |
| 3.159999999999808 | 0 |  |  |
| 3.169999999999808 | 0 |  |  |
| 3.179999999999807 | 0 |  |  |
| 3.189999999999807 | 0 |  |  |
| 3.199999999999807 | 0 |  |  |
| 3.209999999999807 | 0 |  |  |
| 3.219999999999807 | 0 |  |  |
| 3.229999999999806 | 0 |  |  |
| 3.239999999999806 | 0 |  |  |
| 3.249999999999806 | 0 |  |  |
| 3.259999999999806 | 0 |  |  |
| 3.269999999999805 | 0 |  |  |
| 3.279999999999805 | 0 |  |  |
| 3.289999999999805 | 0 |  |  |
| 3.299999999999805 | 0 |  |  |
| 3.309999999999805 | 0 |  |  |
| 3.319999999999804 | 0 |  |  |
| 3.329999999999804 | 0 |  |  |
| 3.339999999999804 | 0 |  |  |
| 3.349999999999804 | 0 |  |  |
| 3.359999999999804 | 0 |  |  |
| 3.369999999999803 | 0 |  |  |
| 3.379999999999803 | 0 |  |  |
| 3.389999999999803 | 0 |  |  |
| 3.399999999999803 | 0 |  |  |
| 3.409999999999802 | 0 |  |  |
| 3.419999999999802 | 0 |  |  |
| 3.429999999999802 | 0 |  |  |
| 3.439999999999802 | 0 |  |  |
| 3.449999999999802 | 0 |  |  |
| 3.459999999999801 | 0 |  |  |
| 3.469999999999801 | 0 |  |  |
| 3.479999999999801 | 0 |  |  |
| 3.489999999999801 | 0 |  |  |
| 3.499999999999801 | 0 |  |  |
| 3.5099999999998 | 0 |  |  |
| 3.5199999999998 | 0 |  |  |
| 3.5299999999998 | 0 |  |  |
| 3.5399999999998 | 0 |  |  |
| 3.5499999999998 | 0 |  |  |
| 3.559999999999799 | 0 |  |  |
| 3.569999999999799 | 0 |  |  |
| 3.579999999999799 | 0 |  |  |
| 3.589999999999799 | 0 |  |  |
| 3.599999999999798 | 0 |  |  |
| 3.609999999999798 | 0 |  |  |
| 3.619999999999798 | 0 |  |  |
| 3.629999999999798 | 0 |  |  |
| 3.639999999999798 | 0 |  |  |
| 3.649999999999797 | 0 |  |  |
| 3.659999999999797 | 0 |  |  |
| 3.669999999999797 | 0 |  |  |
| 3.679999999999797 | 0 |  |  |
| 3.689999999999796 | 0 |  |  |
| 3.699999999999796 | 0 |  |  |
| 3.709999999999796 | 0 |  |  |
| 3.719999999999796 | 0 |  |  |
| 3.729999999999796 | 0 |  |  |
| 3.739999999999795 | 0 |  |  |
| 3.749999999999795 | 0 |  |  |
| 3.759999999999795 | 0 |  |  |
| 3.769999999999795 | 0 |  |  |
| 3.779999999999795 | 0 |  |  |
| 3.789999999999794 | 0 |  |  |
| 3.799999999999794 | 0 |  |  |
| 3.809999999999794 | 0 |  |  |
| 3.819999999999794 | 0 |  |  |
| 3.829999999999794 | 0 |  |  |
| 3.839999999999793 | 0 |  |  |
| 3.849999999999793 | 0 |  |  |
| 3.859999999999793 | 0 |  |  |
| 3.869999999999793 | 0 |  |  |
| 3.879999999999792 | 0 |  |  |
| 3.889999999999792 | 0 |  |  |
| 3.899999999999792 | 0 |  |  |
| 3.909999999999792 | 0 |  |  |
| 3.919999999999792 | 0 |  |  |
| 3.929999999999791 | 0 |  |  |
| 3.939999999999791 | 0 |  |  |
| 3.949999999999791 | 0 |  |  |
| 3.959999999999791 | 0 |  |  |
| 3.969999999999791 | 0 |  |  |
| 3.97999999999979 | 0 |  |  |
| 3.98999999999979 | 0 |  |  |
| 3.99999999999979 | 0 |  |  |
| 4.00999999999979 | 0 |  |  |
| 4.01999999999979 | 0 |  |  |
| 4.02999999999979 | 0 |  |  |
| 4.03999999999979 | 0 |  |  |
| 4.04999999999979 | 0 |  |  |
| 4.05999999999979 | 0 |  |  |
| 4.069999999999789 | 0 |  |  |
| 4.079999999999788 | 0 |  |  |
| 4.089999999999788 | 0 |  |  |
| 4.099999999999788 | 0 |  |  |
| 4.109999999999788 | 0 |  |  |
| 4.119999999999788 | 0 |  |  |
| 4.129999999999788 | 0 |  |  |
| 4.139999999999787 | 0 |  |  |
| 4.149999999999787 | 0 |  |  |
| 4.159999999999787 | 0 |  |  |
| 4.169999999999787 | 0 |  |  |
| 4.179999999999786 | 0 |  |  |
| 4.189999999999786 | 0 |  |  |
| 4.199999999999786 | 0 |  |  |
| 4.209999999999785 | 0 |  |  |
| 4.219999999999785 | 0 |  |  |
| 4.229999999999785 | 0 |  |  |
| 4.239999999999785 | 0 |  |  |
| 4.249999999999785 | 0 |  |  |
| 4.259999999999784 | 0 |  |  |
| 4.269999999999784 | 0 |  |  |
| 4.279999999999784 | 0 |  |  |
| 4.289999999999784 | 0 |  |  |
| 4.299999999999784 | 0 |  |  |
| 4.309999999999784 | 0 |  |  |
| 4.319999999999784 | 0 |  |  |
| 4.329999999999783 | 0 |  |  |
| 4.339999999999783 | 0 |  |  |
| 4.349999999999783 | 0 |  |  |
| 4.359999999999783 | 0 |  |  |
| 4.369999999999782 | 0 |  |  |
| 4.379999999999782 | 0 |  |  |
| 4.389999999999782 | 0 |  |  |
| 4.399999999999782 | 0 |  |  |
| 4.409999999999781 | 0 |  |  |
| 4.419999999999781 | 0 |  |  |
| 4.429999999999781 | 0 |  |  |
| 4.43999999999978 | 0 |  |  |
| 4.44999999999978 | 0 |  |  |
| 4.45999999999978 | 0 |  |  |
| 4.46999999999978 | 0 |  |  |
| 4.47999999999978 | 0 |  |  |
| 4.48999999999978 | 0 |  |  |
| 4.49999999999978 | 0 |  |  |
| 4.50999999999978 | 0 |  |  |
| 4.51999999999978 | 0 |  |  |
| 4.52999999999978 | 0 |  |  |
| 4.539999999999778 | 0 |  |  |
| 4.549999999999778 | 0 |  |  |
| 4.559999999999778 | 0 |  |  |
| 4.569999999999778 | 0 |  |  |
| 4.579999999999778 | 0 |  |  |
| 4.589999999999777 | 0 |  |  |
| 4.599999999999777 | 0 |  |  |
| 4.609999999999777 | 0 |  |  |
| 4.619999999999777 | 0 |  |  |
| 4.629999999999777 | 0 |  |  |
| 4.639999999999776 | 0 |  |  |
| 4.649999999999776 | 0 |  |  |
| 4.659999999999776 | 0 |  |  |
| 4.669999999999776 | 0 |  |  |
| 4.679999999999775 | 0 |  |  |
| 4.689999999999775 | 0 |  |  |
| 4.699999999999775 | 0 |  |  |
| 4.709999999999775 | 0 |  |  |
| 4.719999999999774 | 0 |  |  |
| 4.729999999999774 | 0 |  |  |
| 4.739999999999774 | 0 |  |  |
| 4.749999999999774 | 0 |  |  |
| 4.759999999999774 | 0 |  |  |
| 4.769999999999774 | 0 |  |  |
| 4.779999999999773 | 0 |  |  |
| 4.789999999999773 | 0 |  |  |
| 4.799999999999773 | 0 |  |  |
| 4.809999999999773 | 0 |  |  |
| 4.819999999999773 | 0 |  |  |
| 4.829999999999773 | 0 |  |  |
| 4.839999999999772 | 0 |  |  |
| 4.849999999999772 | 0 |  |  |
| 4.859999999999772 | 0 |  |  |
| 4.869999999999772 | 0 |  |  |
| 4.879999999999771 | 0 |  |  |
| 4.889999999999771 | 0 |  |  |
| 4.899999999999771 | 0 |  |  |
| 4.90999999999977 | 0 |  |  |
| 4.91999999999977 | 0 |  |  |
| 4.92999999999977 | 0 |  |  |
| 4.93999999999977 | 0 |  |  |
| 4.94999999999977 | 0 |  |  |
| 4.95999999999977 | 0 |  |  |
| 4.96999999999977 | 0 |  |  |
| 4.97999999999977 | 0 |  |  |
| 4.98999999999977 | 0 |  |  |
| 4.99999999999977 | 0 |  |  |
| 5.009999999999768 | 0 |  |  |
| 5.019999999999768 | 0 |  |  |
| 5.029999999999768 | 0 |  |  |
| 5.039999999999768 | 0 |  |  |
| 5.049999999999767 | 0 |  |  |
| 5.059999999999767 | 0 |  |  |
| 5.069999999999767 | 0 |  |  |
| 5.079999999999767 | 0 |  |  |
| 5.089999999999767 | 0 |  |  |
| 5.099999999999766 | 0 |  |  |
| 5.109999999999766 | 0 |  |  |
| 5.119999999999766 | 0 |  |  |
| 5.129999999999766 | 0 |  |  |
| 5.139999999999766 | 0 |  |  |
| 5.149999999999765 | 0 |  |  |
| 5.159999999999765 | 0 |  |  |
| 5.169999999999765 | 0 |  |  |
| 5.179999999999765 | 0 |  |  |
| 5.189999999999764 | 0 |  |  |
| 5.199999999999764 | 0 |  |  |
| 5.209999999999764 | 0 |  |  |
| 5.219999999999764 | 0 |  |  |
| 5.229999999999764 | 0 |  |  |
| 5.239999999999763 | 0 |  |  |
| 5.249999999999763 | 0 |  |  |
| 5.259999999999763 | 0 |  |  |
| 5.269999999999763 | 0 |  |  |
| 5.279999999999763 | 0 |  |  |
| 5.289999999999762 | 0 |  |  |
| 5.299999999999762 | 0 |  |  |
| 5.309999999999762 | 0 |  |  |
| 5.319999999999762 | 0 |  |  |
| 5.329999999999762 | 0 |  |  |
| 5.339999999999761 | 0 |  |  |
| 5.349999999999761 | 0 |  |  |
| 5.359999999999761 | 0 |  |  |
| 5.369999999999761 | 0 |  |  |
| 5.37999999999976 | 0 |  |  |
| 5.38999999999976 | 0 |  |  |
| 5.39999999999976 | 0 |  |  |
| 5.40999999999976 | 0 |  |  |
| 5.41999999999976 | 0 |  |  |
| 5.42999999999976 | 0 |  |  |
| 5.43999999999976 | 0 |  |  |
| 5.44999999999976 | 0 |  |  |
| 5.45999999999976 | 0 |  |  |
| 5.46999999999976 | 0 |  |  |
| 5.479999999999758 | 0 |  |  |
| 5.489999999999758 | 0 |  |  |
| 5.499999999999758 | 0 |  |  |
| 5.509999999999758 | 0 |  |  |
| 5.519999999999758 | 0 |  |  |
| 5.529999999999758 | 0 |  |  |
| 5.539999999999757 | 0 |  |  |
| 5.549999999999757 | 0 |  |  |
| 5.559999999999757 | 0 |  |  |
| 5.569999999999757 | 0 |  |  |
| 5.579999999999756 | 0 |  |  |
| 5.589999999999756 | 0 |  |  |
| 5.599999999999756 | 0 |  |  |
| 5.609999999999756 | 0 |  |  |
| 5.619999999999756 | 0 |  |  |
| 5.629999999999756 | 0 |  |  |
| 5.639999999999755 | 0 |  |  |
| 5.649999999999755 | 0 |  |  |
| 5.659999999999755 | 0 |  |  |
| 5.669999999999755 | 0 |  |  |
| 5.679999999999754 | 0 |  |  |
| 5.689999999999754 | 0 |  |  |
| 5.699999999999754 | 0 |  |  |
| 5.709999999999754 | 0 |  |  |
| 5.719999999999754 | 0 |  |  |
| 5.729999999999753 | 0 |  |  |
| 5.739999999999753 | 0 |  |  |
| 5.749999999999753 | 0 |  |  |
| 5.759999999999753 | 0 |  |  |
| 5.769999999999753 | 0 |  |  |
| 5.779999999999752 | 0 |  |  |
| 5.789999999999752 | 0 |  |  |
| 5.799999999999752 | 0 |  |  |
| 5.809999999999752 | 0 |  |  |
| 5.819999999999752 | 0 |  |  |
| 5.829999999999751 | 0 |  |  |
| 5.839999999999751 | 0 |  |  |
| 5.849999999999751 | 0 |  |  |
| 5.859999999999751 | 0 |  |  |
| 5.86999999999975 | 0 |  |  |
| 5.87999999999975 | 0 |  |  |
| 5.88999999999975 | 0 |  |  |
| 5.89999999999975 | 0 |  |  |
| 5.90999999999975 | 0 |  |  |
| 5.91999999999975 | 0 |  |  |
| 5.92999999999975 | 0 |  |  |
| 5.93999999999975 | 0 |  |  |
| 5.949999999999748 | 0 |  |  |
| 5.959999999999748 | 0 |  |  |
| 5.969999999999748 | 0 |  |  |
| 5.979999999999748 | 0 |  |  |
| 5.989999999999747 | 0 |  |  |
| 5.999999999999747 | 0 |  |  |
| 6.009999999999747 | 0 |  |  |
| 6.019999999999747 | 0 |  |  |
| 6.029999999999747 | 0 |  |  |
| 6.039999999999746 | 0 |  |  |
| 6.049999999999746 | 0 |  |  |
| 6.059999999999746 | 0 |  |  |
| 6.069999999999746 | 0 |  |  |
| 6.079999999999746 | 0 |  |  |
| 6.089999999999745 | 0 |  |  |
| 6.099999999999745 | 0 |  |  |
| 6.109999999999745 | 0 |  |  |
| 6.119999999999745 | 0 |  |  |
| 6.129999999999745 | 0 |  |  |
| 6.139999999999744 | 0 |  |  |
| 6.149999999999744 | 0 |  |  |
| 6.159999999999744 | 0 |  |  |
| 6.169999999999744 | 0 |  |  |
| 6.179999999999744 | 0 |  |  |
| 6.189999999999744 | 0 |  |  |
| 6.199999999999743 | 0 |  |  |
| 6.209999999999743 | 0 |  |  |
| 6.219999999999743 | 0 |  |  |
| 6.229999999999743 | 0 |  |  |
| 6.239999999999742 | 0 |  |  |
| 6.249999999999742 | 0 |  |  |
| 6.259999999999742 | 0 |  |  |
| 6.269999999999742 | 0 |  |  |
| 6.279999999999741 | 0 |  |  |
| 6.289999999999741 | 0 |  |  |
| 6.299999999999741 | 0 |  |  |
| 6.309999999999741 | 0 |  |  |
| 6.319999999999741 | 0 |  |  |
| 6.329999999999741 | 0 |  |  |
| 6.33999999999974 | 0 |  |  |
| 6.34999999999974 | 0 |  |  |
| 6.35999999999974 | 0 |  |  |
| 6.36999999999974 | 0 |  |  |
| 6.37999999999974 | 0 |  |  |
| 6.38999999999974 | 0 |  |  |
| 6.39999999999974 | 0 |  |  |
| 6.409999999999738 | 0 |  |  |
| 6.419999999999738 | 0 |  |  |
| 6.429999999999738 | 0 |  |  |
| 6.439999999999738 | 0 |  |  |
| 6.449999999999738 | 0 |  |  |
| 6.459999999999737 | 0 |  |  |
| 6.469999999999737 | 0 |  |  |
| 6.479999999999737 | 0 |  |  |
| 6.489999999999737 | 0 |  |  |
| 6.499999999999737 | 0 |  |  |
| 6.509999999999736 | 0 |  |  |
| 6.519999999999736 | 0 |  |  |
| 6.529999999999736 | 0 |  |  |
| 6.539999999999736 | 0 |  |  |
| 6.549999999999736 | 0 |  |  |
| 6.559999999999735 | 0 |  |  |
| 6.569999999999735 | 0 |  |  |
| 6.579999999999735 | 0 |  |  |
| 6.589999999999735 | 0 |  |  |
| 6.599999999999734 | 0 |  |  |
| 6.609999999999734 | 0 |  |  |
| 6.619999999999734 | 0 |  |  |
| 6.629999999999734 | 0 |  |  |
| 6.639999999999734 | 0 |  |  |
| 6.649999999999734 | 0 |  |  |
| 6.659999999999734 | 0 |  |  |
| 6.669999999999733 | 0 |  |  |
| 6.679999999999733 | 0 |  |  |
| 6.689999999999733 | 0 |  |  |
| 6.699999999999733 | 0 |  |  |
| 6.709999999999732 | 0 |  |  |
| 6.719999999999732 | 0 |  |  |
| 6.729999999999732 | 0 |  |  |
| 6.739999999999731 | 0 |  |  |
| 6.749999999999731 | 0 |  |  |
| 6.759999999999731 | 0 |  |  |
| 6.769999999999731 | 0 |  |  |
| 6.77999999999973 | 0 |  |  |
| 6.78999999999973 | 0 |  |  |
| 6.79999999999973 | 0 |  |  |
| 6.80999999999973 | 0 |  |  |
| 6.81999999999973 | 0 |  |  |
| 6.82999999999973 | 0 |  |  |
| 6.83999999999973 | 0 |  |  |
| 6.84999999999973 | 0 |  |  |
| 6.85999999999973 | 0 |  |  |
| 6.86999999999973 | 0 |  |  |
| 6.879999999999728 | 0 |  |  |
| 6.889999999999728 | 0 |  |  |
| 6.899999999999728 | 0 |  |  |
| 6.909999999999728 | 0 |  |  |
| 6.919999999999728 | 0 |  |  |
| 6.929999999999727 | 0 |  |  |
| 6.939999999999727 | 0 |  |  |
| 6.949999999999727 | 0 |  |  |
| 6.959999999999727 | 0 |  |  |
| 6.969999999999727 | 0 |  |  |
| 6.979999999999726 | 0 |  |  |
| 6.989999999999726 | 0 |  |  |
| 6.999999999999726 | 0 |  |  |
| 7.009999999999726 | 0 |  |  |
| 7.019999999999726 | 0 |  |  |
| 7.029999999999725 | 0 |  |  |
| 7.039999999999725 | 0 |  |  |
| 7.049999999999725 | 0 |  |  |
| 7.059999999999725 | 0 |  |  |
| 7.069999999999724 | 0 |  |  |
| 7.079999999999724 | 0 |  |  |
| 7.089999999999724 | 0 |  |  |
| 7.099999999999724 | 0 |  |  |
| 7.109999999999724 | 0 |  |  |
| 7.119999999999724 | 0 |  |  |
| 7.129999999999724 | 0 |  |  |
| 7.139999999999723 | 0 |  |  |
| 7.149999999999723 | 0 |  |  |
| 7.159999999999723 | 0 |  |  |
| 7.169999999999723 | 0 |  |  |
| 7.179999999999722 | 0 |  |  |
| 7.189999999999722 | 0 |  |  |
| 7.199999999999722 | 0 |  |  |
| 7.209999999999721 | 0 |  |  |
| 7.219999999999721 | 0 |  |  |
| 7.229999999999721 | 0 |  |  |
| 7.23999999999972 | 0 |  |  |
| 7.24999999999972 | 0 |  |  |
| 7.25999999999972 | 0 |  |  |
| 7.26999999999972 | 0 |  |  |
| 7.27999999999972 | 0 |  |  |
| 7.28999999999972 | 0 |  |  |
| 7.29999999999972 | 0 |  |  |
| 7.30999999999972 | 0 |  |  |
| 7.31999999999972 | 0 |  |  |
| 7.329999999999719 | 0 |  |  |
| 7.33999999999972 | 0 |  |  |
| 7.349999999999719 | 0 |  |  |
| 7.359999999999719 | 0 |  |  |
| 7.369999999999718 | 0 |  |  |
| 7.379999999999718 | 0 |  |  |
| 7.389999999999718 | 0 |  |  |
| 7.399999999999718 | 0 |  |  |
| 7.409999999999717 | 0 |  |  |
| 7.419999999999717 | 0 |  |  |
| 7.429999999999717 | 0 |  |  |
| 7.439999999999717 | 0 |  |  |
| 7.449999999999716 | 0 |  |  |
| 7.459999999999716 | 0 |  |  |
| 7.469999999999716 | 0 |  |  |
| 7.479999999999716 | 0 |  |  |
| 7.489999999999715 | 0 |  |  |
| 7.499999999999715 | 0 |  |  |
| 7.509999999999715 | 0 |  |  |
| 7.519999999999715 | 0 |  |  |
| 7.529999999999715 | 0 |  |  |
| 7.539999999999714 | 0 |  |  |
| 7.549999999999714 | 0 |  |  |
| 7.559999999999714 | 0 |  |  |
| 7.569999999999714 | 0 |  |  |
| 7.579999999999714 | 0 |  |  |
| 7.589999999999714 | 0 |  |  |
| 7.599999999999714 | 0 |  |  |
| 7.609999999999713 | 0 |  |  |
| 7.619999999999713 | 0 |  |  |
| 7.629999999999713 | 0 |  |  |
| 7.639999999999713 | 0 |  |  |
| 7.649999999999712 | 0 |  |  |
| 7.659999999999712 | 0 |  |  |
| 7.669999999999712 | 0 |  |  |
| 7.679999999999712 | 0 |  |  |
| 7.689999999999712 | 0 |  |  |
| 7.699999999999711 | 0 |  |  |
| 7.709999999999711 | 0 |  |  |
| 7.719999999999711 | 0 |  |  |
| 7.729999999999711 | 0 |  |  |
| 7.73999999999971 | 0 |  |  |
| 7.74999999999971 | 0 |  |  |
| 7.75999999999971 | 0 |  |  |
| 7.76999999999971 | 0 |  |  |
| 7.77999999999971 | 0 |  |  |
| 7.78999999999971 | 0 |  |  |
| 7.79999999999971 | 0 |  |  |
| 7.80999999999971 | 0 |  |  |
| 7.819999999999709 | 0 |  |  |
| 7.829999999999709 | 0 |  |  |
| 7.839999999999708 | 0 |  |  |
| 7.849999999999708 | 0 |  |  |
| 7.859999999999708 | 0 |  |  |
| 7.869999999999708 | 0 |  |  |
| 7.879999999999707 | 0 |  |  |
| 7.889999999999707 | 0 |  |  |
| 7.899999999999707 | 0 |  |  |
| 7.909999999999707 | 0 |  |  |
| 7.919999999999706 | 0 |  |  |
| 7.929999999999706 | 0 |  |  |
| 7.939999999999706 | 0 |  |  |
| 7.949999999999706 | 0 |  |  |
| 7.959999999999705 | 0 |  |  |
| 7.969999999999705 | 0 |  |  |
| 7.979999999999705 | 0 |  |  |
| 7.989999999999705 | 0 |  |  |
| 7.999999999999705 | 0 |  |  |
| 8.009999999999703 | 0 |  |  |
| 8.019999999999705 | 0 |  |  |
| 8.029999999999704 | 0 |  |  |
| 8.039999999999704 | 0 |  |  |
| 8.049999999999704 | 0 |  |  |
| 8.059999999999704 | 0 |  |  |
| 8.069999999999704 | 0 |  |  |
| 8.079999999999703 | 0 |  |  |
| 8.089999999999703 | 0 |  |  |
| 8.099999999999701 | 0 |  |  |
| 8.109999999999703 | 0 |  |  |
| 8.119999999999703 | 0 |  |  |
| 8.129999999999702 | 0 |  |  |
| 8.139999999999702 | 0 |  |  |
| 8.1499999999997 | 0 |  |  |
| 8.1599999999997 | 0 |  |  |
| 8.1699999999997 | 0 |  |  |
| 8.1799999999997 | 0 |  |  |
| 8.1899999999997 | 0 |  |  |
| 8.1999999999997 | 0 |  |  |
| 8.2099999999997 | 0 |  |  |
| 8.2199999999997 | 0 |  |  |
| 8.2299999999997 | 0 |  |  |
| 8.2399999999997 | 0 |  |  |
| 8.2499999999997 | 0 |  |  |
| 8.2599999999997 | 0 |  |  |
| 8.2699999999997 | 0 |  |  |
| 8.2799999999997 | 0 |  |  |
| 8.289999999999697 | 0 |  |  |
| 8.299999999999699 | 0 |  |  |
| 8.309999999999699 | 0 |  |  |
| 8.319999999999698 | 0 |  |  |
| 8.329999999999698 | 0 |  |  |
| 8.339999999999698 | 0 |  |  |
| 8.349999999999698 | 0 |  |  |
| 8.359999999999697 | 0 |  |  |
| 8.369999999999697 | 0 |  |  |
| 8.379999999999695 | 0 |  |  |
| 8.389999999999697 | 0 |  |  |
| 8.399999999999697 | 0 |  |  |
| 8.409999999999696 | 0 |  |  |
| 8.419999999999696 | 0 |  |  |
| 8.429999999999694 | 0 |  |  |
| 8.439999999999696 | 0 |  |  |
| 8.449999999999696 | 0 |  |  |
| 8.459999999999695 | 0 |  |  |
| 8.469999999999695 | 0 |  |  |
| 8.479999999999693 | 0 |  |  |
| 8.489999999999695 | 0 |  |  |
| 8.499999999999694 | 0 |  |  |
| 8.509999999999694 | 0 |  |  |
| 8.519999999999694 | 0 |  |  |
| 8.529999999999694 | 0 |  |  |
| 8.539999999999694 | 0 |  |  |
| 8.549999999999693 | 0 |  |  |
| 8.55999999999969 | 0 |  |  |
| 8.56999999999969 | 0 |  |  |
| 8.57999999999969 | 0 |  |  |
| 8.58999999999969 | 0 |  |  |
| 8.59999999999969 | 0 |  |  |
| 8.60999999999969 | 0 |  |  |
| 8.61999999999969 | 0 |  |  |
| 8.62999999999969 | 0 |  |  |
| 8.63999999999969 | 0 |  |  |
| 8.64999999999969 | 0 |  |  |
| 8.65999999999969 | 0 |  |  |
| 8.66999999999969 | 0 |  |  |
| 8.67999999999969 | 0 |  |  |
| 8.68999999999969 | 0 |  |  |
| 8.69999999999969 | 0 |  |  |
| 8.70999999999969 | 0 |  |  |
| 8.71999999999969 | 0 |  |  |
| 8.72999999999969 | 0 |  |  |
| 8.73999999999969 | 0 |  |  |
| 8.74999999999969 | 0 |  |  |
| 8.759999999999687 | 0 |  |  |
| 8.769999999999689 | 0 |  |  |
| 8.779999999999688 | 0 |  |  |
| 8.789999999999688 | 0 |  |  |
| 8.799999999999686 | 0 |  |  |
| 8.809999999999688 | 0 |  |  |
| 8.819999999999688 | 0 |  |  |
| 8.829999999999687 | 0 |  |  |
| 8.839999999999687 | 0 |  |  |
| 8.849999999999685 | 0 |  |  |
| 8.859999999999687 | 0 |  |  |
| 8.869999999999687 | 0 |  |  |
| 8.879999999999686 | 0 |  |  |
| 8.889999999999686 | 0 |  |  |
| 8.899999999999684 | 0 |  |  |
| 8.909999999999686 | 0 |  |  |
| 8.919999999999686 | 0 |  |  |
| 8.929999999999685 | 0 |  |  |
| 8.939999999999685 | 0 |  |  |
| 8.949999999999685 | 0 |  |  |
| 8.959999999999685 | 0 |  |  |
| 8.969999999999684 | 0 |  |  |
| 8.979999999999684 | 0 |  |  |
| 8.989999999999682 | 0 |  |  |
| 8.999999999999684 | 0 |  |  |
| 9.009999999999684 | 0 |  |  |
| 9.019999999999683 | 0 |  |  |
| 9.029999999999683 | 0 |  |  |
| 9.039999999999681 | 0 |  |  |
| 9.049999999999683 | 0 |  |  |
| 9.05999999999968 | 0 |  |  |
| 9.06999999999968 | 0 |  |  |
| 9.07999999999968 | 0 |  |  |
| 9.08999999999968 | 0 |  |  |
| 9.09999999999968 | 0 |  |  |
| 9.10999999999968 | 0 |  |  |
| 9.11999999999968 | 0 |  |  |
| 9.12999999999968 | 0 |  |  |
| 9.13999999999968 | 0 |  |  |
| 9.14999999999968 | 0 |  |  |
| 9.15999999999968 | 0 |  |  |
| 9.16999999999968 | 0 |  |  |
| 9.17999999999968 | 0 |  |  |
| 9.18999999999968 | 0 |  |  |
| 9.19999999999968 | 0 |  |  |
| 9.20999999999968 | 0 |  |  |
| 9.21999999999968 | 0 |  |  |
| 9.229999999999677 | 0 |  |  |
| 9.239999999999679 | 0 |  |  |
| 9.249999999999678 | 0 |  |  |
| 9.259999999999678 | 0 |  |  |
| 9.269999999999678 | 0 |  |  |
| 9.279999999999678 | 0 |  |  |
| 9.289999999999678 | 0 |  |  |
| 9.299999999999677 | 0 |  |  |
| 9.309999999999677 | 0 |  |  |
| 9.319999999999675 | 0 |  |  |
| 9.329999999999677 | 0 |  |  |
| 9.339999999999677 | 0 |  |  |
| 9.349999999999676 | 0 |  |  |
| 9.359999999999676 | 0 |  |  |
| 9.369999999999674 | 0 |  |  |
| 9.379999999999676 | 0 |  |  |
| 9.389999999999675 | 0 |  |  |
| 9.399999999999675 | 0 |  |  |
| 9.409999999999675 | 0 |  |  |
| 9.419999999999675 | 0 |  |  |
| 9.429999999999675 | 0 |  |  |
| 9.439999999999674 | 0 |  |  |
| 9.449999999999674 | 0 |  |  |
| 9.459999999999672 | 0 |  |  |
| 9.469999999999674 | 0 |  |  |
| 9.479999999999674 | 0 |  |  |
| 9.489999999999673 | 0 |  |  |
| 9.499999999999673 | 0 |  |  |
| 9.509999999999671 | 0 |  |  |
| 9.519999999999673 | 0 |  |  |
| 9.529999999999673 | 0 |  |  |
| 9.539999999999672 | 0 |  |  |
| 9.549999999999672 | 0 |  |  |
| 9.55999999999967 | 0 |  |  |
| 9.56999999999967 | 0 |  |  |
| 9.57999999999967 | 0 |  |  |
| 9.58999999999967 | 0 |  |  |
| 9.59999999999967 | 0 |  |  |
| 9.60999999999967 | 0 |  |  |
| 9.61999999999967 | 0 |  |  |
| 9.62999999999967 | 0 |  |  |
| 9.63999999999967 | 0 |  |  |
| 9.64999999999967 | 0 |  |  |
| 9.65999999999967 | 0 |  |  |
| 9.66999999999967 | 0 |  |  |
| 9.67999999999967 | 0 |  |  |
| 9.689999999999667 | 0 |  |  |
| 9.699999999999669 | 0 |  |  |
| 9.709999999999669 | 0 |  |  |
| 9.719999999999668 | 0 |  |  |
| 9.729999999999668 | 0 |  |  |
| 9.739999999999666 | 0 |  |  |
| 9.749999999999668 | 0 |  |  |
| 9.759999999999668 | 0 |  |  |
| 9.769999999999667 | 0 |  |  |
| 9.779999999999667 | 0 |  |  |
| 9.789999999999665 | 0 |  |  |
| 9.799999999999667 | 0 |  |  |
| 9.809999999999667 | 0 |  |  |
| 9.819999999999666 | 0 |  |  |
| 9.829999999999666 | 0 |  |  |
| 9.839999999999664 | 0 |  |  |
| 9.849999999999666 | 0 |  |  |
| 9.859999999999665 | 0 |  |  |
| 9.869999999999665 | 0 |  |  |
| 9.879999999999663 | 0 |  |  |
| 9.889999999999665 | 0 |  |  |
| 9.899999999999665 | 0 |  |  |
| 9.909999999999664 | 0 |  |  |
| 9.919999999999664 | 0 |  |  |
| 9.929999999999662 | 0 |  |  |
| 9.939999999999664 | 0 |  |  |
| 9.949999999999664 | 0 |  |  |
| 9.95999999999966 | 0 |  |  |
| 9.96999999999966 | 0 |  |  |
| 9.97999999999966 | 0 |  |  |
| 9.98999999999966 | 0 |  |  |
| 9.99999999999966 | 0 |  |  |